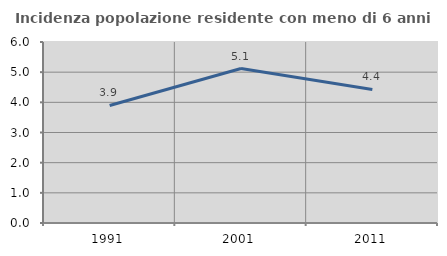
| Category | Incidenza popolazione residente con meno di 6 anni |
|---|---|
| 1991.0 | 3.896 |
| 2001.0 | 5.12 |
| 2011.0 | 4.428 |